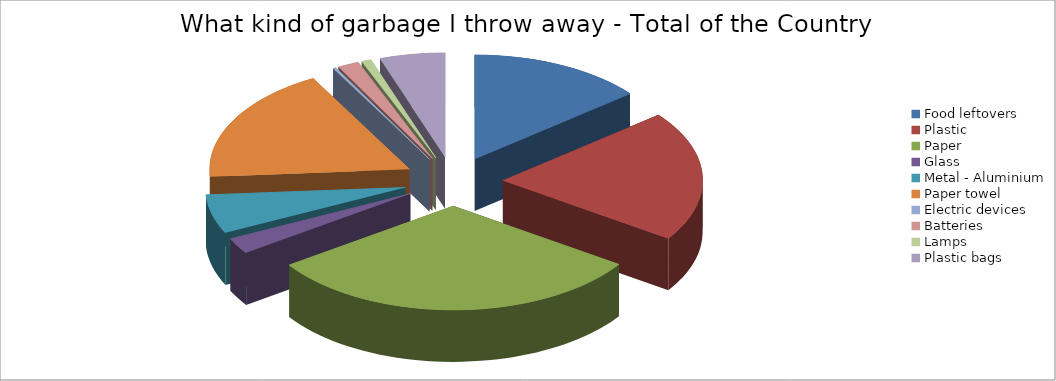
| Category | Food leftovers | What kind of garbage I throw away - Total of the Country |
|---|---|---|
| Food leftovers | 17.513 |  |
| Plastic | 25.043 |  |
| Paper | 38.174 |  |
| Glass | 3.043 |  |
| Metal - Aluminium | 7.478 |  |
| Paper towel | 22.348 |  |
| Electric devices | 0.304 |  |
| Batteries | 2.13 |  |
| Lamps | 0.957 |  |
| Plastic bags | 6.522 |  |